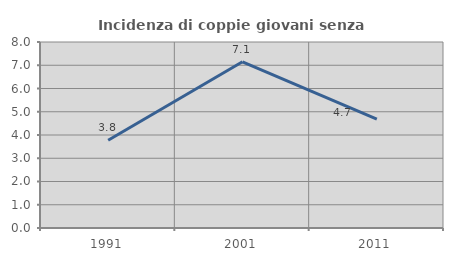
| Category | Incidenza di coppie giovani senza figli |
|---|---|
| 1991.0 | 3.774 |
| 2001.0 | 7.15 |
| 2011.0 | 4.685 |